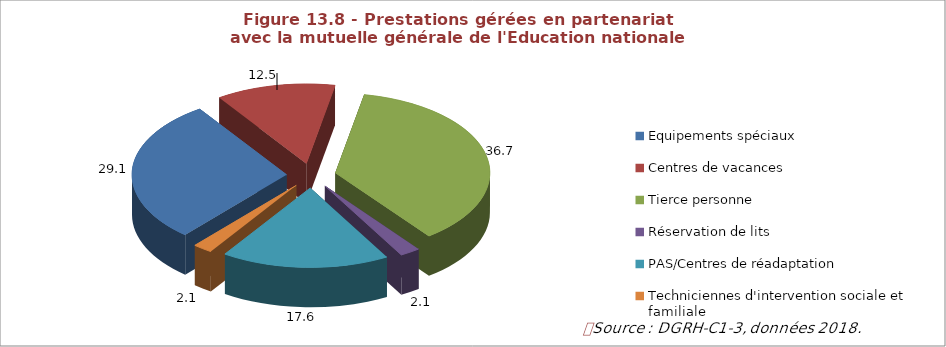
| Category | Dépenses totales |
|---|---|
| Equipements spéciaux | 29.106 |
| Centres de vacances | 12.486 |
| Tierce personne | 36.659 |
| Réservation de lits | 2.127 |
| PAS/Centres de réadaptation | 17.556 |
| Techniciennes d'intervention sociale et familiale | 2.065 |